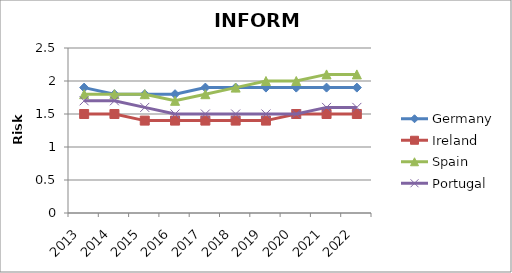
| Category | Germany | Ireland | Spain | Portugal |
|---|---|---|---|---|
| 2013.0 | 1.9 | 1.5 | 1.8 | 1.7 |
| 2014.0 | 1.8 | 1.5 | 1.8 | 1.7 |
| 2015.0 | 1.8 | 1.4 | 1.8 | 1.6 |
| 2016.0 | 1.8 | 1.4 | 1.7 | 1.5 |
| 2017.0 | 1.9 | 1.4 | 1.8 | 1.5 |
| 2018.0 | 1.9 | 1.4 | 1.9 | 1.5 |
| 2019.0 | 1.9 | 1.4 | 2 | 1.5 |
| 2020.0 | 1.9 | 1.5 | 2 | 1.5 |
| 2021.0 | 1.9 | 1.5 | 2.1 | 1.6 |
| 2022.0 | 1.9 | 1.5 | 2.1 | 1.6 |